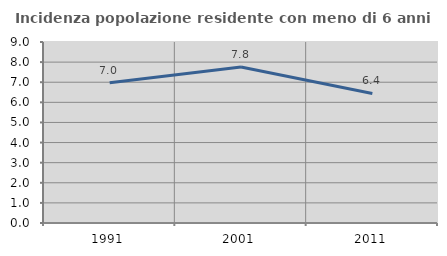
| Category | Incidenza popolazione residente con meno di 6 anni |
|---|---|
| 1991.0 | 6.977 |
| 2001.0 | 7.756 |
| 2011.0 | 6.442 |